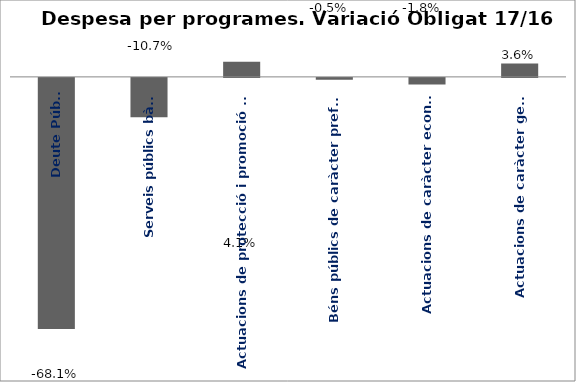
| Category | Series 0 |
|---|---|
| Deute Públic | -0.681 |
| Serveis públics bàsics | -0.107 |
| Actuacions de protecció i promoció social | 0.041 |
| Béns públics de caràcter preferent | -0.005 |
| Actuacions de caràcter econòmic | -0.018 |
| Actuacions de caràcter general | 0.036 |